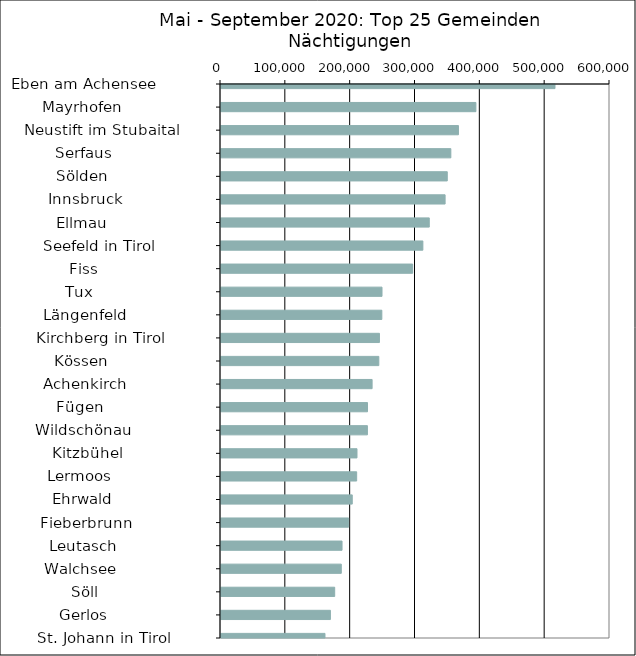
| Category | Series 0 |
|---|---|
|   Eben am Achensee           | 515165 |
|   Mayrhofen                  | 393159 |
|   Neustift im Stubaital      | 366230 |
|   Serfaus                    | 354507 |
|   Sölden                     | 349006 |
|   Innsbruck                  | 345662 |
|   Ellmau                     | 321246 |
|   Seefeld in Tirol           | 311366 |
|   Fiss                       | 295622 |
|   Tux                        | 248341 |
|   Längenfeld                 | 248088 |
|   Kirchberg in Tirol         | 244380 |
|   Kössen                     | 243427 |
|   Achenkirch                 | 233065 |
|   Fügen                      | 225972 |
|   Wildschönau                | 225836 |
|   Kitzbühel                  | 209745 |
|   Lermoos                    | 209258 |
|   Ehrwald                    | 202447 |
|   Fieberbrunn                | 196877 |
|   Leutasch                   | 186684 |
|   Walchsee                   | 185540 |
|   Söll                       | 175375 |
|   Gerlos                     | 168774 |
|   St. Johann in Tirol        | 160377 |